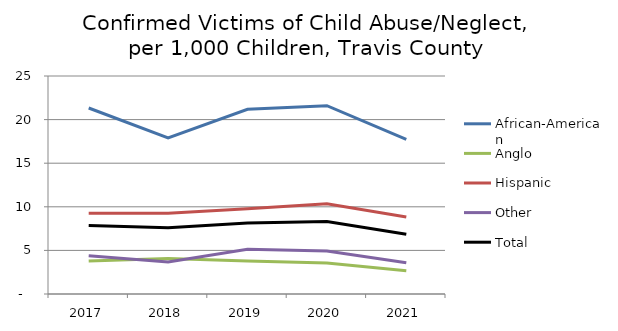
| Category | African-American | Anglo | Hispanic | Other | Total |
|---|---|---|---|---|---|
| 2017.0 | 21.329 | 3.777 | 9.269 | 4.398 | 7.856 |
| 2018.0 | 17.891 | 4.076 | 9.264 | 3.674 | 7.592 |
| 2019.0 | 21.175 | 3.783 | 9.784 | 5.13 | 8.135 |
| 2020.0 | 21.599 | 3.565 | 10.354 | 4.929 | 8.321 |
| 2021.0 | 17.738 | 2.669 | 8.833 | 3.573 | 6.846 |